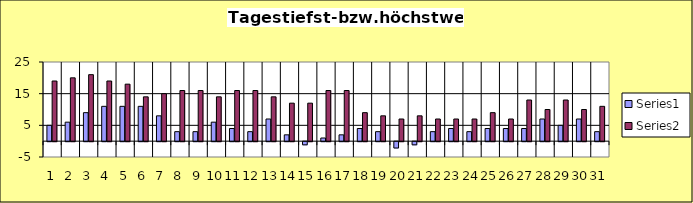
| Category | Series 0 | Series 1 |
|---|---|---|
| 0 | 5 | 19 |
| 1 | 6 | 20 |
| 2 | 9 | 21 |
| 3 | 11 | 19 |
| 4 | 11 | 18 |
| 5 | 11 | 14 |
| 6 | 8 | 15 |
| 7 | 3 | 16 |
| 8 | 3 | 16 |
| 9 | 6 | 14 |
| 10 | 4 | 16 |
| 11 | 3 | 16 |
| 12 | 7 | 14 |
| 13 | 2 | 12 |
| 14 | -1 | 12 |
| 15 | 1 | 16 |
| 16 | 2 | 16 |
| 17 | 4 | 9 |
| 18 | 3 | 8 |
| 19 | -2 | 7 |
| 20 | -1 | 8 |
| 21 | 3 | 7 |
| 22 | 4 | 7 |
| 23 | 3 | 7 |
| 24 | 4 | 9 |
| 25 | 4 | 7 |
| 26 | 4 | 13 |
| 27 | 7 | 10 |
| 28 | 5 | 13 |
| 29 | 7 | 10 |
| 30 | 3 | 11 |